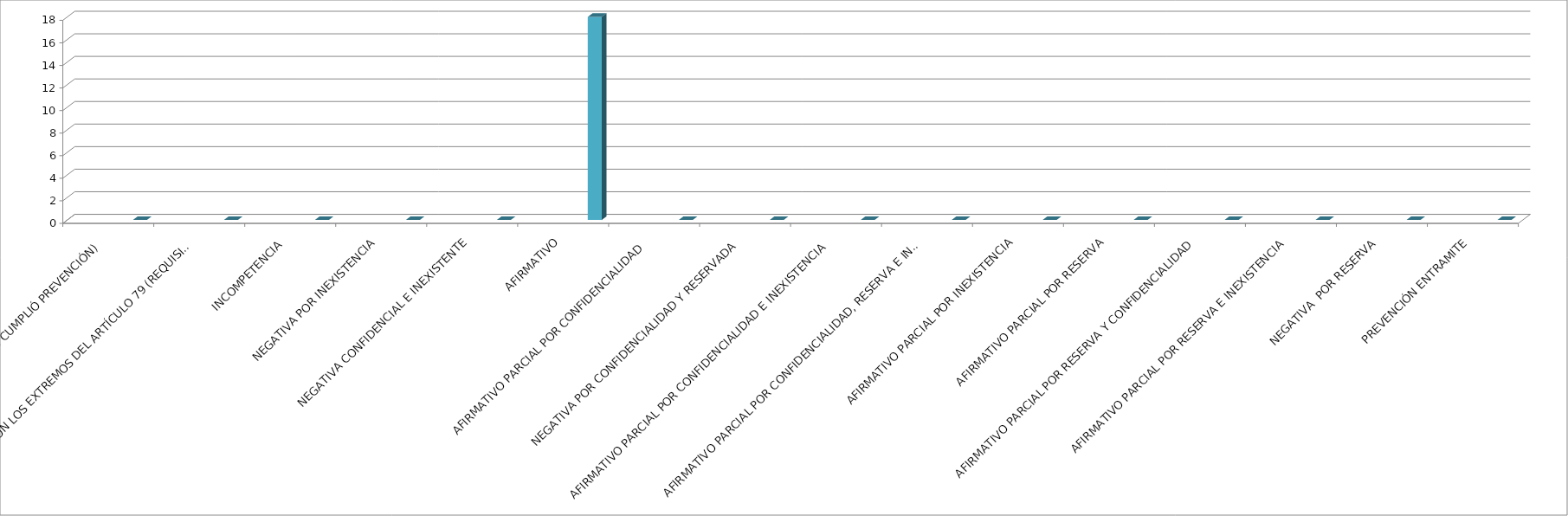
| Category | Series 0 | Series 1 | Series 2 | Series 3 | Series 4 |
|---|---|---|---|---|---|
| SE TIENE POR NO PRESENTADA ( NO CUMPLIÓ PREVENCIÓN) |  |  |  |  | 0 |
| NO CUMPLIO CON LOS EXTREMOS DEL ARTÍCULO 79 (REQUISITOS) |  |  |  |  | 0 |
| INCOMPETENCIA  |  |  |  |  | 0 |
| NEGATIVA POR INEXISTENCIA |  |  |  |  | 0 |
| NEGATIVA CONFIDENCIAL E INEXISTENTE |  |  |  |  | 0 |
| AFIRMATIVO |  |  |  |  | 18 |
| AFIRMATIVO PARCIAL POR CONFIDENCIALIDAD  |  |  |  |  | 0 |
| NEGATIVA POR CONFIDENCIALIDAD Y RESERVADA |  |  |  |  | 0 |
| AFIRMATIVO PARCIAL POR CONFIDENCIALIDAD E INEXISTENCIA |  |  |  |  | 0 |
| AFIRMATIVO PARCIAL POR CONFIDENCIALIDAD, RESERVA E INEXISTENCIA |  |  |  |  | 0 |
| AFIRMATIVO PARCIAL POR INEXISTENCIA |  |  |  |  | 0 |
| AFIRMATIVO PARCIAL POR RESERVA |  |  |  |  | 0 |
| AFIRMATIVO PARCIAL POR RESERVA Y CONFIDENCIALIDAD |  |  |  |  | 0 |
| AFIRMATIVO PARCIAL POR RESERVA E INEXISTENCIA |  |  |  |  | 0 |
| NEGATIVA  POR RESERVA |  |  |  |  | 0 |
| PREVENCIÓN ENTRAMITE |  |  |  |  | 0 |